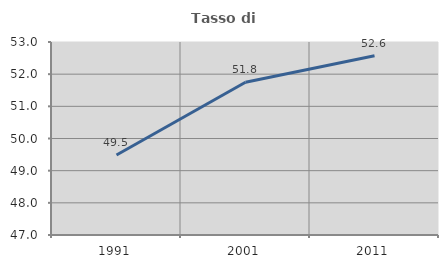
| Category | Tasso di occupazione   |
|---|---|
| 1991.0 | 49.485 |
| 2001.0 | 51.751 |
| 2011.0 | 52.571 |